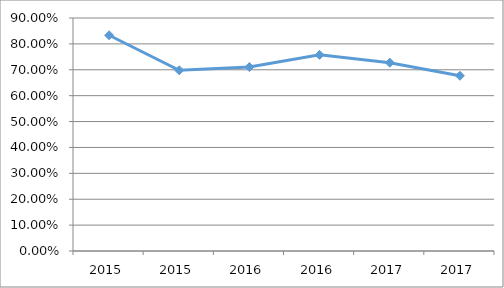
| Category | CIMA-D2O02 |
|---|---|
| 2015.0 | 0.833 |
| 2015.0 | 0.698 |
| 2016.0 | 0.711 |
| 2016.0 | 0.758 |
| 2017.0 | 0.727 |
| 2017.0 | 0.677 |